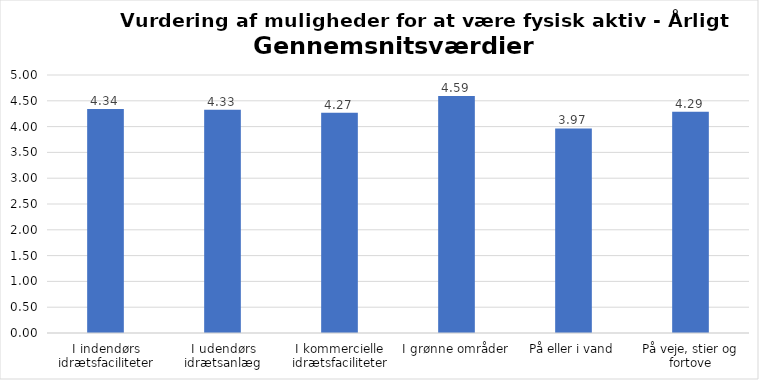
| Category | Gennemsnit |
|---|---|
| I indendørs idrætsfaciliteter | 4.341 |
| I udendørs idrætsanlæg | 4.326 |
| I kommercielle idrætsfaciliteter | 4.268 |
| I grønne områder | 4.592 |
| På eller i vand | 3.965 |
| På veje, stier og fortove | 4.287 |